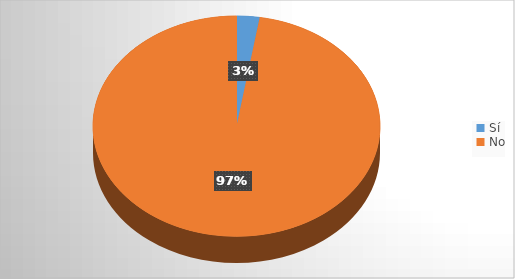
| Category | Series 0 |
|---|---|
| Sí | 15 |
| No | 566 |